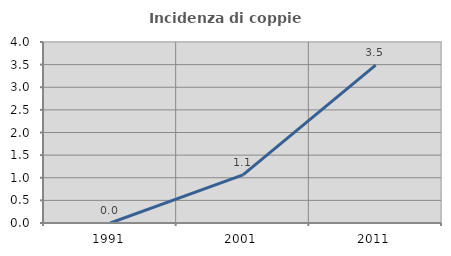
| Category | Incidenza di coppie miste |
|---|---|
| 1991.0 | 0 |
| 2001.0 | 1.064 |
| 2011.0 | 3.488 |